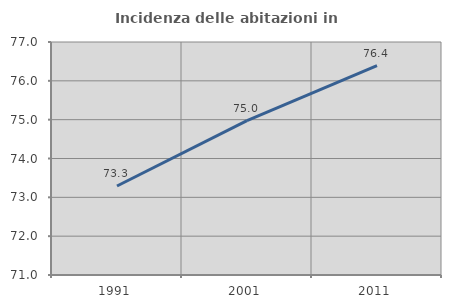
| Category | Incidenza delle abitazioni in proprietà  |
|---|---|
| 1991.0 | 73.291 |
| 2001.0 | 74.975 |
| 2011.0 | 76.394 |